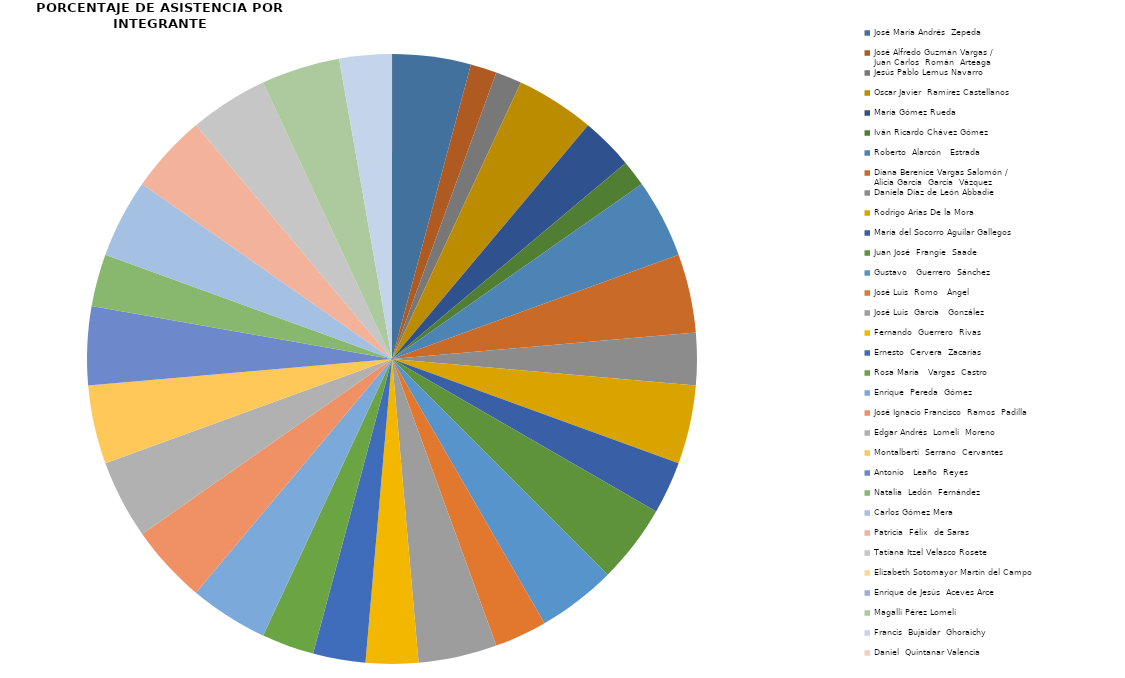
| Category | Series 0 |
|---|---|
| José María Andrés  Zepeda | 3 |
| José Alfredo Guzmán Vargas / 
Juan Carlos  Román  Arteaga | 1 |
| Jesús Pablo Lemus Navarro | 1 |
| Oscar Javier  Ramírez Castellanos | 3 |
| María Gómez Rueda | 2 |
| Iván Ricardo Chávez Gómez | 1 |
| Roberto  Alarcón   Estrada | 3 |
| Diana Berenice Vargas Salomón /
Alicia García  García  Vázquez | 3 |
| Daniela Díaz de León Abbadie | 2 |
| Rodrigo Arias De la Mora | 3 |
| María del Socorro Aguilar Gallegos | 2 |
| Juan José  Frangie  Saade | 3 |
| Gustavo   Guerrero  Sánchez | 3 |
| José Luis  Romo   Ángel | 2 |
| José Luis  García   González | 3 |
| Fernando  Guerrero  Rivas  | 2 |
| Ernesto  Cervera  Zacarías  | 2 |
| Rosa María   Vargas  Castro | 2 |
| Enrique  Pereda  Gómez | 3 |
| José Ignacio Francisco  Ramos  Padilla | 3 |
| Edgar Andrés  Lomelí  Moreno | 3 |
| Montalberti  Serrano  Cervantes | 3 |
| Antonio   Leaño  Reyes | 3 |
| Natalia  Ledón  Fernández | 2 |
| Carlos Gómez Mera | 3 |
| Patricia  Félix  de Saras  | 3 |
| Tatiana Itzel Velasco Rosete | 3 |
| Elizabeth Sotomayor Martín del Campo | 0 |
| Enrique de Jesús  Aceves Arce | 0 |
| Magalli Pérez Lomelí | 3 |
| Francis  Bujaidar  Ghoraichy | 2 |
| Daniel  Quintanar Valencia | 0 |